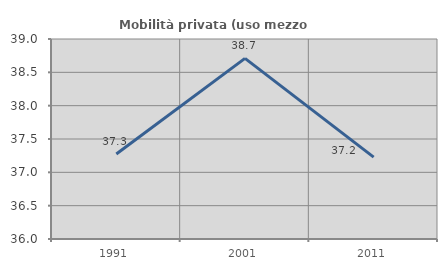
| Category | Mobilità privata (uso mezzo privato) |
|---|---|
| 1991.0 | 37.275 |
| 2001.0 | 38.71 |
| 2011.0 | 37.229 |